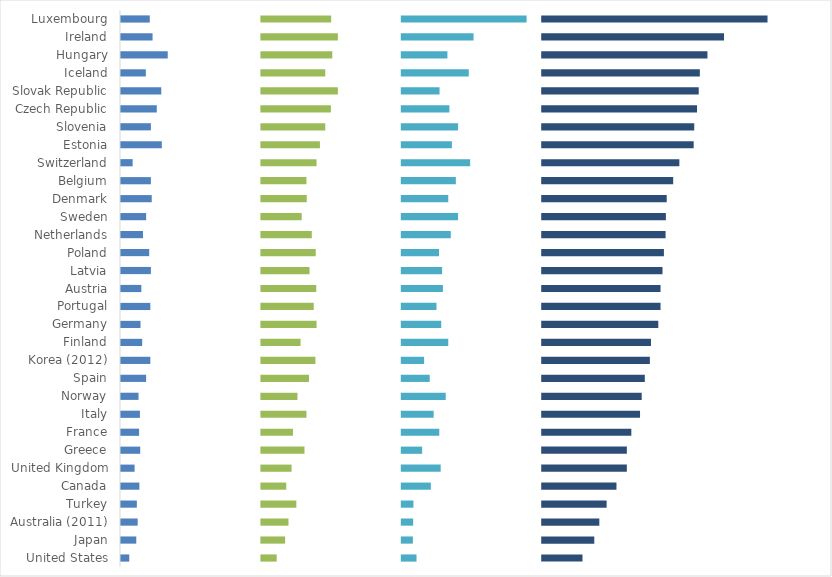
| Category | High skilled | Filler1 | Medium skilled | Filler2 | Low skilled | Filler3 | Total |
|---|---|---|---|---|---|---|---|
| Luxembourg | 10.6 | 39.4 | 25.2 | 24.8 | 44.8 | 5.2 | 80.6 |
| Ireland | 11.6 | 38.4 | 27.6 | 22.4 | 25.9 | 24.1 | 65.1 |
| Hungary | 17 | 33 | 25.6 | 24.4 | 16.6 | 33.4 | 59.2 |
| Iceland | 9.2 | 40.8 | 23.1 | 26.9 | 24.2 | 25.8 | 56.5 |
| Slovak Republic | 14.7 | 35.3 | 27.6 | 22.4 | 13.8 | 36.2 | 56.1 |
| Czech Republic | 13.1 | 36.9 | 25.1 | 24.9 | 17.3 | 32.7 | 55.5 |
| Slovenia | 11 | 39 | 23.1 | 26.9 | 20.4 | 29.6 | 54.5 |
| Estonia | 14.9 | 35.1 | 21.2 | 28.8 | 18.2 | 31.8 | 54.3 |
| Switzerland | 4.5 | 45.5 | 20 | 30 | 24.7 | 25.3 | 49.2 |
| Belgium | 11 | 39 | 16.4 | 33.6 | 19.6 | 30.4 | 47 |
| Denmark | 11.3 | 38.7 | 16.5 | 33.5 | 16.9 | 33.1 | 44.7 |
| Sweden | 9.3 | 40.7 | 14.7 | 35.3 | 20.4 | 29.6 | 44.4 |
| Netherlands | 8.2 | 41.8 | 18.3 | 31.7 | 17.8 | 32.2 | 44.3 |
| Poland | 10.4 | 39.6 | 19.7 | 30.3 | 13.6 | 36.4 | 43.7 |
| Latvia | 11 | 39 | 17.5 | 32.5 | 14.7 | 35.3 | 43.2 |
| Austria | 7.6 | 42.4 | 19.9 | 30.1 | 15 | 35 | 42.5 |
| Portugal | 10.8 | 39.2 | 19 | 31 | 12.7 | 37.3 | 42.5 |
| Germany | 7.3 | 42.7 | 20 | 30 | 14.4 | 35.6 | 41.7 |
| Finland | 7.9 | 42.1 | 14.3 | 35.7 | 16.9 | 33.1 | 39.1 |
| Korea (2012) | 10.8 | 39.2 | 19.6 | 30.4 | 8.3 | 41.7 | 38.7 |
| Spain | 9.3 | 40.7 | 17.3 | 32.7 | 10.3 | 39.7 | 36.9 |
| Norway | 6.6 | 43.4 | 13.2 | 36.8 | 16 | 34 | 35.8 |
| Italy | 7.1 | 42.9 | 16.4 | 33.6 | 11.7 | 38.3 | 35.2 |
| France | 6.8 | 43.2 | 11.6 | 38.4 | 13.7 | 36.3 | 32.1 |
| Greece | 7.2 | 42.8 | 15.7 | 34.3 | 7.6 | 42.4 | 30.5 |
| United Kingdom | 5.2 | 44.8 | 11.1 | 38.9 | 14.2 | 35.8 | 30.5 |
| Canada | 6.9 | 43.1 | 9.2 | 40.8 | 10.7 | 39.3 | 26.8 |
| Turkey | 6 | 44 | 12.8 | 37.2 | 4.5 | 45.5 | 23.3 |
| Australia (2011) | 6.3 | 43.7 | 10 | 40 | 4.4 | 45.6 | 20.7 |
| Japan | 5.8 | 44.2 | 8.8 | 41.2 | 4.3 | 45.7 | 18.9 |
| United States | 3.3 | 46.7 | 5.8 | 44.2 | 5.6 | 44.4 | 14.7 |